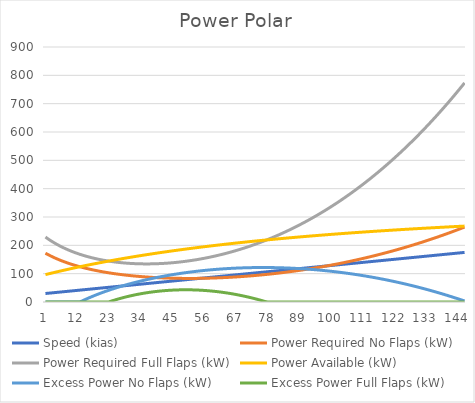
| Category | Speed (kias) | Power Required No Flaps (kW) | Power Required Full Flaps (kW) | Power Available (kW) | Excess Power No Flaps (kW) | Excess Power Full Flaps (kW) |
|---|---|---|---|---|---|---|
| 0 | 30 | 172.196 | 229.24 | 96.662 | 0 | 0 |
| 1 | 31 | 166.684 | 222.033 | 99.18 | 0 | 0 |
| 2 | 32 | 161.529 | 215.316 | 101.662 | 0 | 0 |
| 3 | 33 | 156.7 | 209.05 | 104.109 | 0 | 0 |
| 4 | 34 | 152.168 | 203.197 | 106.52 | 0 | 0 |
| 5 | 35 | 147.911 | 197.725 | 108.898 | 0 | 0 |
| 6 | 36 | 143.904 | 192.605 | 111.242 | 0 | 0 |
| 7 | 37 | 140.131 | 187.814 | 113.553 | 0 | 0 |
| 8 | 38 | 136.572 | 183.327 | 115.831 | 0 | 0 |
| 9 | 39 | 133.213 | 179.124 | 118.078 | 0 | 0 |
| 10 | 40 | 130.04 | 175.189 | 120.294 | 0 | 0 |
| 11 | 41 | 127.04 | 171.504 | 122.479 | 0 | 0 |
| 12 | 42 | 124.201 | 168.054 | 124.634 | 0.433 | 0 |
| 13 | 43 | 121.515 | 164.827 | 126.76 | 5.245 | 0 |
| 14 | 44 | 118.971 | 161.812 | 128.857 | 9.886 | 0 |
| 15 | 45 | 116.56 | 158.996 | 130.925 | 14.365 | 0 |
| 16 | 46 | 114.276 | 156.37 | 132.966 | 18.69 | 0 |
| 17 | 47 | 112.112 | 153.926 | 134.979 | 22.867 | 0 |
| 18 | 48 | 110.06 | 151.655 | 136.965 | 26.906 | 0 |
| 19 | 49 | 108.115 | 149.551 | 138.925 | 30.81 | 0 |
| 20 | 50 | 106.272 | 147.606 | 140.859 | 34.587 | 0 |
| 21 | 51 | 104.525 | 145.814 | 142.767 | 38.242 | 0 |
| 22 | 52 | 102.871 | 144.17 | 144.651 | 41.779 | 0.481 |
| 23 | 53 | 101.305 | 142.669 | 146.509 | 45.204 | 3.84 |
| 24 | 54 | 99.824 | 141.306 | 148.344 | 48.52 | 7.037 |
| 25 | 55 | 98.423 | 140.078 | 150.155 | 51.732 | 10.077 |
| 26 | 56 | 97.099 | 138.979 | 151.942 | 54.842 | 12.963 |
| 27 | 57 | 95.851 | 138.007 | 153.706 | 57.856 | 15.699 |
| 28 | 58 | 94.673 | 137.159 | 155.448 | 60.775 | 18.289 |
| 29 | 59 | 93.565 | 136.431 | 157.168 | 63.602 | 20.737 |
| 30 | 60 | 92.524 | 135.821 | 158.866 | 66.342 | 23.045 |
| 31 | 61 | 91.547 | 135.326 | 160.542 | 68.995 | 25.216 |
| 32 | 62 | 90.633 | 134.944 | 162.197 | 71.564 | 27.253 |
| 33 | 63 | 89.78 | 134.673 | 163.832 | 74.052 | 29.159 |
| 34 | 64 | 88.985 | 134.511 | 165.446 | 76.461 | 30.935 |
| 35 | 65 | 88.247 | 134.457 | 167.04 | 78.793 | 32.583 |
| 36 | 66 | 87.565 | 134.509 | 168.614 | 81.049 | 34.105 |
| 37 | 67 | 86.938 | 134.665 | 170.169 | 83.232 | 35.504 |
| 38 | 68 | 86.363 | 134.925 | 171.705 | 85.342 | 36.781 |
| 39 | 69 | 85.84 | 135.287 | 173.223 | 87.383 | 37.936 |
| 40 | 70 | 85.368 | 135.749 | 174.721 | 89.354 | 38.972 |
| 41 | 71 | 84.945 | 136.312 | 176.202 | 91.257 | 39.89 |
| 42 | 72 | 84.57 | 136.974 | 177.664 | 93.094 | 40.69 |
| 43 | 73 | 84.244 | 137.735 | 179.109 | 94.866 | 41.374 |
| 44 | 74 | 83.964 | 138.594 | 180.537 | 96.574 | 41.943 |
| 45 | 75 | 83.73 | 139.55 | 181.948 | 98.218 | 42.398 |
| 46 | 76 | 83.541 | 140.603 | 183.342 | 99.801 | 42.739 |
| 47 | 77 | 83.397 | 141.753 | 184.719 | 101.323 | 42.966 |
| 48 | 78 | 83.297 | 142.999 | 186.081 | 102.784 | 43.082 |
| 49 | 79 | 83.24 | 144.34 | 187.426 | 104.186 | 43.086 |
| 50 | 80 | 83.226 | 145.777 | 188.755 | 105.53 | 42.978 |
| 51 | 81 | 83.254 | 147.309 | 190.069 | 106.816 | 42.76 |
| 52 | 82 | 83.324 | 148.937 | 191.368 | 108.044 | 42.431 |
| 53 | 83 | 83.435 | 150.66 | 192.652 | 109.217 | 41.992 |
| 54 | 84 | 83.587 | 152.478 | 193.921 | 110.333 | 41.443 |
| 55 | 85 | 83.781 | 154.391 | 195.175 | 111.395 | 40.784 |
| 56 | 86 | 84.014 | 156.399 | 196.415 | 112.401 | 40.016 |
| 57 | 87 | 84.287 | 158.503 | 197.641 | 113.354 | 39.138 |
| 58 | 88 | 84.6 | 160.702 | 198.853 | 114.253 | 38.151 |
| 59 | 89 | 84.953 | 162.996 | 200.052 | 115.099 | 37.055 |
| 60 | 90 | 85.344 | 165.387 | 201.237 | 115.892 | 35.85 |
| 61 | 91 | 85.775 | 167.873 | 202.408 | 116.633 | 34.536 |
| 62 | 92 | 86.245 | 170.455 | 203.567 | 117.322 | 33.112 |
| 63 | 93 | 86.753 | 173.133 | 204.712 | 117.959 | 31.579 |
| 64 | 94 | 87.299 | 175.908 | 205.845 | 118.546 | 29.937 |
| 65 | 95 | 87.885 | 178.781 | 206.965 | 119.081 | 28.185 |
| 66 | 96 | 88.508 | 181.75 | 208.074 | 119.566 | 26.323 |
| 67 | 97 | 89.169 | 184.818 | 209.169 | 120 | 24.352 |
| 68 | 98 | 89.869 | 187.983 | 210.253 | 120.384 | 22.27 |
| 69 | 99 | 90.606 | 191.247 | 211.325 | 120.719 | 20.079 |
| 70 | 100 | 91.382 | 194.609 | 212.386 | 121.004 | 17.777 |
| 71 | 101 | 92.195 | 198.071 | 213.435 | 121.24 | 15.364 |
| 72 | 102 | 93.047 | 201.633 | 214.473 | 121.426 | 12.84 |
| 73 | 103 | 93.936 | 205.295 | 215.499 | 121.563 | 10.204 |
| 74 | 104 | 94.863 | 209.057 | 216.515 | 121.652 | 7.457 |
| 75 | 105 | 95.828 | 212.921 | 217.52 | 121.692 | 4.598 |
| 76 | 106 | 96.831 | 216.887 | 218.514 | 121.683 | 1.627 |
| 77 | 107 | 97.871 | 220.954 | 219.497 | 121.626 | 0 |
| 78 | 108 | 98.95 | 225.125 | 220.47 | 121.521 | 0 |
| 79 | 109 | 100.066 | 229.399 | 221.433 | 121.367 | 0 |
| 80 | 110 | 101.221 | 233.776 | 222.386 | 121.165 | 0 |
| 81 | 111 | 102.414 | 238.258 | 223.329 | 120.916 | 0 |
| 82 | 112 | 103.644 | 242.845 | 224.262 | 120.618 | 0 |
| 83 | 113 | 104.913 | 247.538 | 225.186 | 120.272 | 0 |
| 84 | 114 | 106.221 | 252.336 | 226.1 | 119.879 | 0 |
| 85 | 115 | 107.566 | 257.242 | 227.004 | 119.438 | 0 |
| 86 | 116 | 108.951 | 262.255 | 227.9 | 118.949 | 0 |
| 87 | 117 | 110.373 | 267.376 | 228.786 | 118.412 | 0 |
| 88 | 118 | 111.835 | 272.605 | 229.663 | 117.828 | 0 |
| 89 | 119 | 113.335 | 277.944 | 230.531 | 117.196 | 0 |
| 90 | 120 | 114.875 | 283.393 | 231.39 | 116.516 | 0 |
| 91 | 121 | 116.453 | 288.952 | 232.241 | 115.788 | 0 |
| 92 | 122 | 118.07 | 294.622 | 233.083 | 115.013 | 0 |
| 93 | 123 | 119.727 | 300.405 | 233.917 | 114.19 | 0 |
| 94 | 124 | 121.423 | 306.3 | 234.742 | 113.319 | 0 |
| 95 | 125 | 123.159 | 312.308 | 235.56 | 112.401 | 0 |
| 96 | 126 | 124.935 | 318.43 | 236.369 | 111.434 | 0 |
| 97 | 127 | 126.75 | 324.667 | 237.17 | 110.42 | 0 |
| 98 | 128 | 128.605 | 331.019 | 237.963 | 109.358 | 0 |
| 99 | 129 | 130.501 | 337.487 | 238.748 | 108.247 | 0 |
| 100 | 130 | 132.437 | 344.072 | 239.526 | 107.089 | 0 |
| 101 | 131 | 134.413 | 350.774 | 240.296 | 105.883 | 0 |
| 102 | 132 | 136.431 | 357.594 | 241.059 | 104.628 | 0 |
| 103 | 133 | 138.489 | 364.533 | 241.814 | 103.326 | 0 |
| 104 | 134 | 140.588 | 371.592 | 242.562 | 101.974 | 0 |
| 105 | 135 | 142.728 | 378.771 | 243.303 | 100.575 | 0 |
| 106 | 136 | 144.91 | 386.071 | 244.037 | 99.127 | 0 |
| 107 | 137 | 147.133 | 393.493 | 244.763 | 97.63 | 0 |
| 108 | 138 | 149.398 | 401.037 | 245.483 | 96.085 | 0 |
| 109 | 139 | 151.705 | 408.704 | 246.196 | 94.491 | 0 |
| 110 | 140 | 154.054 | 416.496 | 246.902 | 92.848 | 0 |
| 111 | 141 | 156.445 | 424.412 | 247.601 | 91.156 | 0 |
| 112 | 142 | 158.879 | 432.453 | 248.294 | 89.415 | 0 |
| 113 | 143 | 161.356 | 440.621 | 248.98 | 87.624 | 0 |
| 114 | 144 | 163.876 | 448.915 | 249.66 | 85.785 | 0 |
| 115 | 145 | 166.438 | 457.338 | 250.334 | 83.896 | 0 |
| 116 | 146 | 169.044 | 465.889 | 251.001 | 81.957 | 0 |
| 117 | 147 | 171.694 | 474.569 | 251.662 | 79.968 | 0 |
| 118 | 148 | 174.387 | 483.379 | 252.317 | 77.93 | 0 |
| 119 | 149 | 177.124 | 492.32 | 252.966 | 75.842 | 0 |
| 120 | 150 | 179.906 | 501.392 | 253.609 | 73.703 | 0 |
| 121 | 151 | 182.732 | 510.597 | 254.246 | 71.515 | 0 |
| 122 | 152 | 185.602 | 519.934 | 254.878 | 69.276 | 0 |
| 123 | 153 | 188.517 | 529.406 | 255.503 | 66.986 | 0 |
| 124 | 154 | 191.478 | 539.012 | 256.123 | 64.645 | 0 |
| 125 | 155 | 194.483 | 548.754 | 256.737 | 62.254 | 0 |
| 126 | 156 | 197.534 | 558.632 | 257.346 | 59.812 | 0 |
| 127 | 157 | 200.631 | 568.647 | 257.949 | 57.319 | 0 |
| 128 | 158 | 203.773 | 578.799 | 258.547 | 54.774 | 0 |
| 129 | 159 | 206.962 | 589.09 | 259.14 | 52.178 | 0 |
| 130 | 160 | 210.197 | 599.521 | 259.727 | 49.53 | 0 |
| 131 | 161 | 213.479 | 610.091 | 260.309 | 46.83 | 0 |
| 132 | 162 | 216.807 | 620.803 | 260.886 | 44.079 | 0 |
| 133 | 163 | 220.183 | 631.656 | 261.457 | 41.275 | 0 |
| 134 | 164 | 223.605 | 642.652 | 262.024 | 38.419 | 0 |
| 135 | 165 | 227.076 | 653.791 | 262.586 | 35.51 | 0 |
| 136 | 166 | 230.594 | 665.074 | 263.143 | 32.549 | 0 |
| 137 | 167 | 234.16 | 676.502 | 263.694 | 29.535 | 0 |
| 138 | 168 | 237.774 | 688.076 | 264.242 | 26.468 | 0 |
| 139 | 169 | 241.437 | 699.797 | 264.784 | 23.347 | 0 |
| 140 | 170 | 245.148 | 711.664 | 265.322 | 20.174 | 0 |
| 141 | 171 | 248.908 | 723.68 | 265.855 | 16.946 | 0 |
| 142 | 172 | 252.718 | 735.845 | 266.383 | 13.665 | 0 |
| 143 | 173 | 256.577 | 748.159 | 266.907 | 10.33 | 0 |
| 144 | 174 | 260.485 | 760.624 | 267.426 | 6.941 | 0 |
| 145 | 175 | 264.444 | 773.24 | 267.941 | 3.498 | 0 |